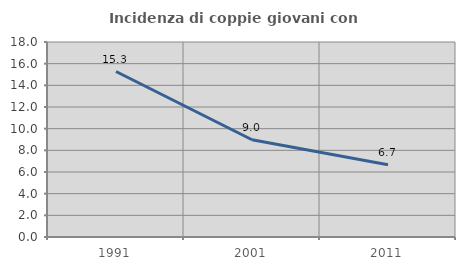
| Category | Incidenza di coppie giovani con figli |
|---|---|
| 1991.0 | 15.276 |
| 2001.0 | 8.979 |
| 2011.0 | 6.667 |